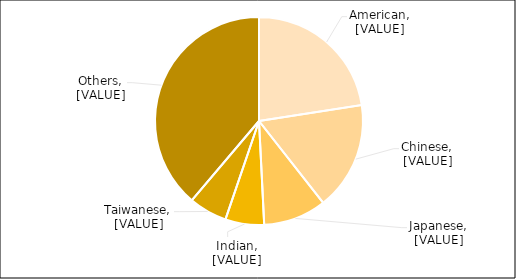
| Category | Series 0 |
|---|---|
| American | 22.546 |
| Chinese | 16.862 |
| Japanese | 9.793 |
| Indian | 6.025 |
| Taiwanese | 5.961 |
| Others | 38.812 |